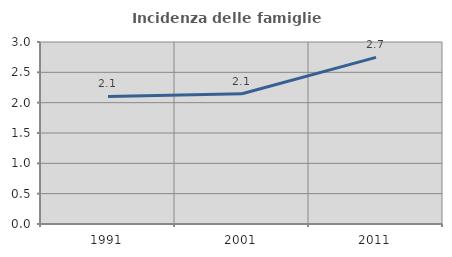
| Category | Incidenza delle famiglie numerose |
|---|---|
| 1991.0 | 2.103 |
| 2001.0 | 2.148 |
| 2011.0 | 2.746 |